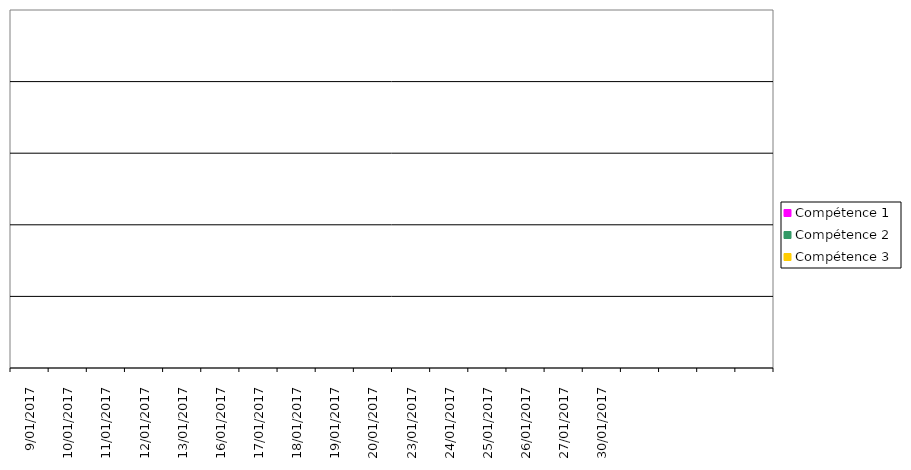
| Category | Compétence 1 | Compétence 2 | Compétence 3 |
|---|---|---|---|
| 9-01-2017 | 0 | 0 | 0 |
| 10-01-2017 | 0 | 0 | 0 |
| 11-01-2017 | 0 | 0 | 0 |
| 12-01-2017 | 0 | 0 | 0 |
| 13-01-2017 | 0 | 0 | 0 |
| 16-01-2017 | 0 | 0 | 0 |
| 17-01-2017 | 0 | 0 | 0 |
| 18-01-2017 | 0 | 0 | 0 |
| 19-01-2017 | 0 | 0 | 0 |
| 20-01-2017 | 0 | 0 | 0 |
| 23-01-2017 | 0 | 0 | 0 |
| 24-01-2017 | 0 | 0 | 0 |
| 25-01-2017 | 0 | 0 | 0 |
| 26-01-2017 | 0 | 0 | 0 |
| 27-01-2017 | 0 | 0 | 0 |
| 30-01-2017 | 0 | 0 | 0 |